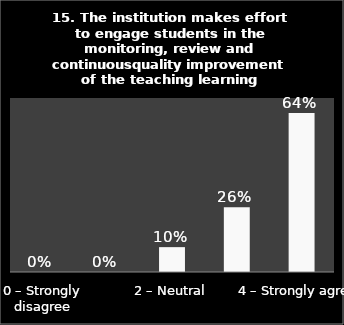
| Category | Series 0 |
|---|---|
| 0 – Strongly disagree | 0 |
| 1 – Disagree | 0 |
| 2 – Neutral | 0.1 |
| 3 – Agree | 0.26 |
| 4 – Strongly agree | 0.64 |